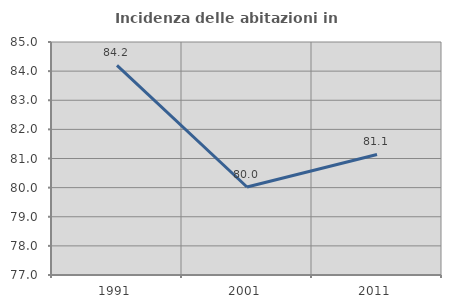
| Category | Incidenza delle abitazioni in proprietà  |
|---|---|
| 1991.0 | 84.198 |
| 2001.0 | 80.021 |
| 2011.0 | 81.138 |